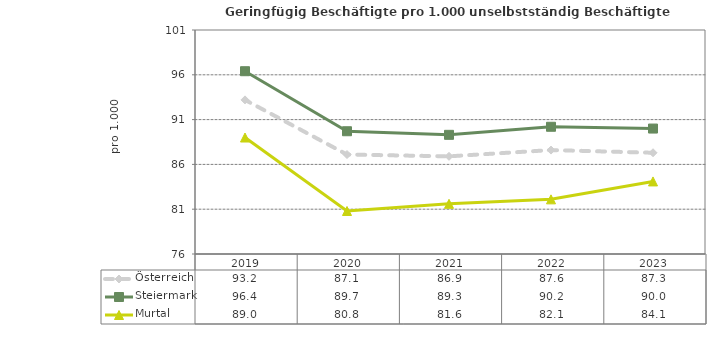
| Category | Österreich | Steiermark | Murtal |
|---|---|---|---|
| 2023.0 | 87.3 | 90 | 84.1 |
| 2022.0 | 87.6 | 90.2 | 82.1 |
| 2021.0 | 86.9 | 89.3 | 81.6 |
| 2020.0 | 87.1 | 89.7 | 80.8 |
| 2019.0 | 93.2 | 96.4 | 89 |